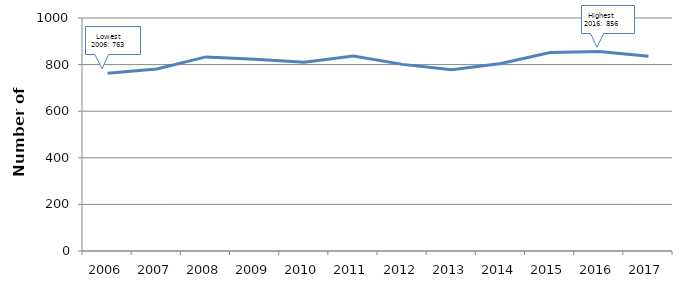
| Category | Series 0 |
|---|---|
| 2006.0 | 763 |
| 2007.0 | 781 |
| 2008.0 | 833 |
| 2009.0 | 823 |
| 2010.0 | 810 |
| 2011.0 | 837 |
| 2012.0 | 801 |
| 2013.0 | 778 |
| 2014.0 | 805 |
| 2015.0 | 852 |
| 2016.0 | 856 |
| 2017.0 | 836 |